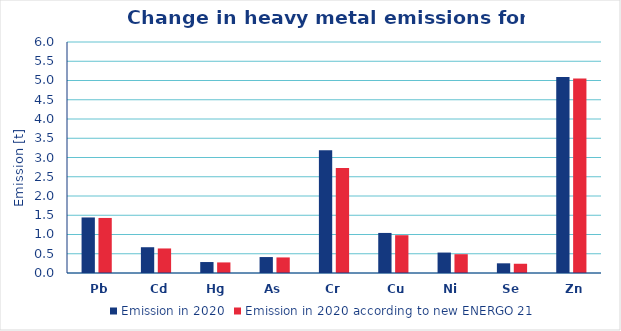
| Category | Emission in 2020 | Emission in 2020 according to new ENERGO 21 |
|---|---|---|
| Pb | 1.443 | 1.43 |
| Cd | 0.67 | 0.637 |
| Hg | 0.285 | 0.275 |
| As | 0.414 | 0.404 |
| Cr | 3.191 | 2.727 |
| Cu | 1.041 | 0.982 |
| Ni | 0.531 | 0.488 |
| Se | 0.251 | 0.24 |
| Zn | 5.092 | 5.051 |